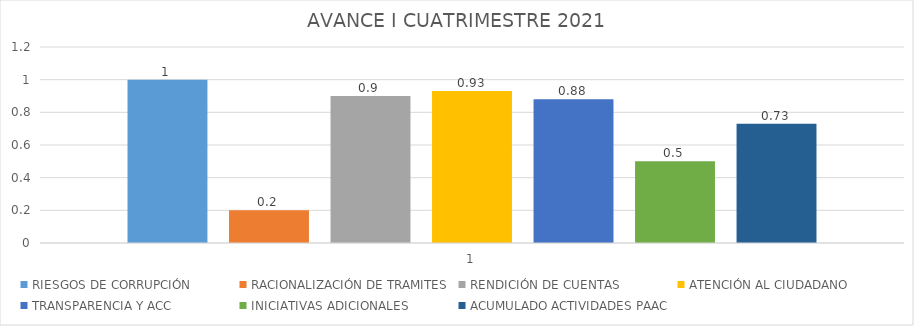
| Category | RIESGOS DE CORRUPCIÓN | RACIONALIZACIÓN DE TRAMITES | RENDICIÓN DE CUENTAS | ATENCIÓN AL CIUDADANO | TRANSPARENCIA Y ACC | INICIATIVAS ADICIONALES | ACUMULADO ACTIVIDADES PAAC |
|---|---|---|---|---|---|---|---|
| 0 | 1 | 0.2 | 0.9 | 0.93 | 0.88 | 0.5 | 0.73 |